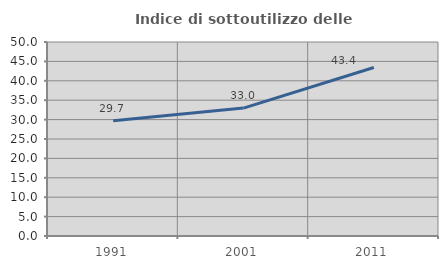
| Category | Indice di sottoutilizzo delle abitazioni  |
|---|---|
| 1991.0 | 29.73 |
| 2001.0 | 32.967 |
| 2011.0 | 43.421 |